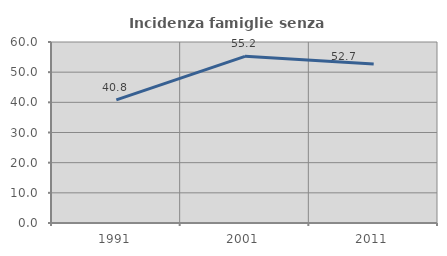
| Category | Incidenza famiglie senza nuclei |
|---|---|
| 1991.0 | 40.789 |
| 2001.0 | 55.242 |
| 2011.0 | 52.72 |